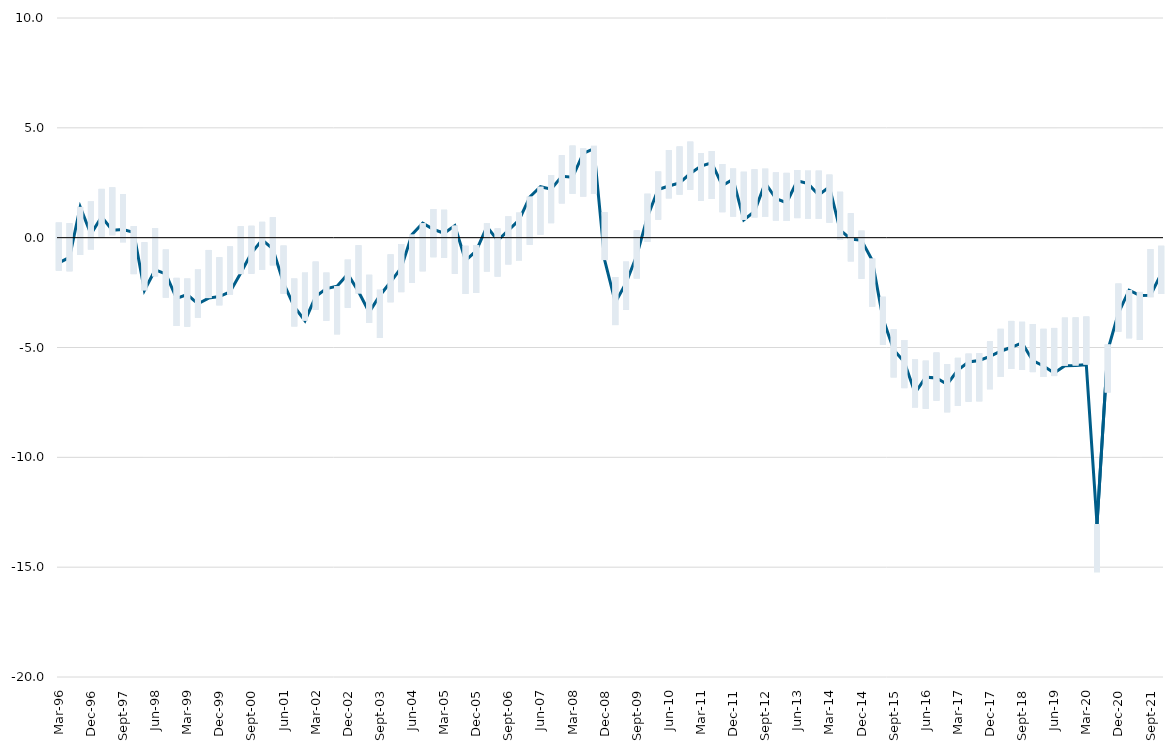
| Category | Intervalo inferior | Hiato | Intervalo superior |
|---|---|---|---|
| 1996-03-01 | -1.5 | -1.15 | 0.69 |
| 1996-06-01 | -1.53 | -0.9 | 0.66 |
| 1996-09-01 | -0.79 | 1.4 | 1.4 |
| 1996-12-01 | -0.54 | 0.16 | 1.65 |
| 1997-03-01 | 0.04 | 0.95 | 2.22 |
| 1997-06-01 | 0.11 | 0.34 | 2.29 |
| 1997-09-01 | -0.21 | 0.37 | 1.98 |
| 1997-12-01 | -1.66 | 0.24 | 0.53 |
| 1998-03-01 | -2.4 | -2.4 | -0.21 |
| 1998-06-01 | -1.76 | -1.47 | 0.43 |
| 1998-09-01 | -2.73 | -1.65 | -0.54 |
| 1998-12-01 | -4.02 | -2.76 | -1.83 |
| 1999-03-01 | -4.05 | -2.59 | -1.86 |
| 1999-06-01 | -3.64 | -3.01 | -1.45 |
| 1999-09-01 | -2.75 | -2.75 | -0.56 |
| 1999-12-01 | -3.08 | -2.68 | -0.89 |
| 2000-03-01 | -2.59 | -2.47 | -0.4 |
| 2000-06-01 | -1.66 | -1.61 | 0.52 |
| 2000-09-01 | -1.64 | -0.7 | 0.54 |
| 2000-12-01 | -1.47 | -0.1 | 0.72 |
| 2001-03-01 | -1.26 | -0.51 | 0.93 |
| 2001-06-01 | -2.55 | -2.07 | -0.36 |
| 2001-09-01 | -4.04 | -3.14 | -1.86 |
| 2001-12-01 | -3.78 | -3.78 | -1.59 |
| 2002-03-01 | -3.28 | -2.68 | -1.09 |
| 2002-06-01 | -3.78 | -2.32 | -1.59 |
| 2002-09-01 | -4.4 | -2.21 | -2.21 |
| 2002-12-01 | -3.19 | -1.66 | -1 |
| 2003-03-01 | -2.54 | -2.45 | -0.35 |
| 2003-06-01 | -3.88 | -3.39 | -1.69 |
| 2003-09-01 | -4.56 | -2.63 | -2.37 |
| 2003-12-01 | -2.94 | -2.02 | -0.76 |
| 2004-03-01 | -2.48 | -1.36 | -0.29 |
| 2004-06-01 | -2.05 | 0.14 | 0.14 |
| 2004-09-01 | -1.53 | 0.66 | 0.66 |
| 2004-12-01 | -0.89 | 0.38 | 1.3 |
| 2005-03-01 | -0.92 | 0.2 | 1.27 |
| 2005-06-01 | -1.64 | 0.55 | 0.55 |
| 2005-09-01 | -2.56 | -1.04 | -0.37 |
| 2005-12-01 | -2.52 | -0.6 | -0.34 |
| 2006-03-01 | -1.54 | 0.5 | 0.65 |
| 2006-06-01 | -1.77 | -0.13 | 0.42 |
| 2006-09-01 | -1.22 | 0.33 | 0.97 |
| 2006-12-01 | -1.04 | 0.8 | 1.14 |
| 2007-03-01 | -0.32 | 1.85 | 1.87 |
| 2007-06-01 | 0.13 | 2.32 | 2.32 |
| 2007-09-01 | 0.66 | 2.21 | 2.85 |
| 2007-12-01 | 1.56 | 2.79 | 3.75 |
| 2008-03-01 | 2 | 2.75 | 4.19 |
| 2008-06-01 | 1.87 | 3.84 | 4.06 |
| 2008-09-01 | 1.99 | 4.05 | 4.18 |
| 2008-12-01 | -1.02 | -1.02 | 1.16 |
| 2009-03-01 | -3.98 | -2.95 | -1.79 |
| 2009-06-01 | -3.28 | -2.06 | -1.09 |
| 2009-09-01 | -1.86 | -0.81 | 0.33 |
| 2009-12-01 | -0.19 | 0.95 | 2 |
| 2010-03-01 | 0.82 | 2.19 | 3.01 |
| 2010-06-01 | 1.79 | 2.35 | 3.98 |
| 2010-09-01 | 1.96 | 2.49 | 4.15 |
| 2010-12-01 | 2.18 | 2.92 | 4.37 |
| 2011-03-01 | 1.67 | 3.26 | 3.85 |
| 2011-06-01 | 1.76 | 3.41 | 3.94 |
| 2011-09-01 | 1.16 | 2.37 | 3.35 |
| 2011-12-01 | 0.96 | 2.66 | 3.15 |
| 2012-03-01 | 0.81 | 0.81 | 3 |
| 2012-06-01 | 0.92 | 1.19 | 3.11 |
| 2012-09-01 | 0.95 | 2.49 | 3.14 |
| 2012-12-01 | 0.78 | 1.78 | 2.97 |
| 2013-03-01 | 0.76 | 1.59 | 2.95 |
| 2013-06-01 | 0.89 | 2.59 | 3.08 |
| 2013-09-01 | 0.86 | 2.46 | 3.05 |
| 2013-12-01 | 0.86 | 1.94 | 3.05 |
| 2014-03-01 | 0.68 | 2.31 | 2.87 |
| 2014-06-01 | -0.09 | 0.34 | 2.09 |
| 2014-09-01 | -1.08 | -0.06 | 1.11 |
| 2014-12-01 | -1.87 | -0.12 | 0.32 |
| 2015-03-01 | -3.14 | -1.03 | -0.95 |
| 2015-06-01 | -4.88 | -3.68 | -2.69 |
| 2015-09-01 | -6.36 | -5.1 | -4.17 |
| 2015-12-01 | -6.85 | -5.66 | -4.66 |
| 2016-03-01 | -7.73 | -7.07 | -5.54 |
| 2016-06-01 | -7.79 | -6.35 | -5.6 |
| 2016-09-01 | -7.42 | -6.39 | -5.23 |
| 2016-12-01 | -7.95 | -6.67 | -5.76 |
| 2017-03-01 | -7.66 | -6.03 | -5.47 |
| 2017-06-01 | -7.47 | -5.66 | -5.28 |
| 2017-09-01 | -7.45 | -5.59 | -5.26 |
| 2017-12-01 | -6.9 | -5.4 | -4.72 |
| 2018-03-01 | -6.34 | -5.17 | -4.15 |
| 2018-06-01 | -5.98 | -4.99 | -3.79 |
| 2018-09-01 | -6.02 | -4.79 | -3.83 |
| 2018-12-01 | -6.12 | -5.6 | -3.93 |
| 2019-03-01 | -6.34 | -5.84 | -4.15 |
| 2019-06-01 | -6.3 | -6.16 | -4.11 |
| 2019-09-01 | -5.83 | -5.83 | -3.64 |
| 2019-12-01 | -5.82 | -5.82 | -3.63 |
| 2020-03-01 | -5.78 | -5.78 | -3.59 |
| 2020-06-01 | -15.23 | -13.04 | -13.04 |
| 2020-09-01 | -7.05 | -5.14 | -4.86 |
| 2020-12-01 | -4.28 | -3.436 | -2.09 |
| 2021-03-01 | -4.58 | -2.39 | -2.39 |
| 2021-06-01 | -4.66 | -2.63 | -2.47 |
| 2021-09-01 | -2.71 | -2.62 | -0.52 |
| 2021-12-01 | -2.56 | -1.64 | -0.37 |